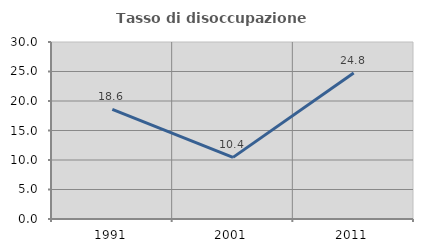
| Category | Tasso di disoccupazione giovanile  |
|---|---|
| 1991.0 | 18.598 |
| 2001.0 | 10.448 |
| 2011.0 | 24.757 |